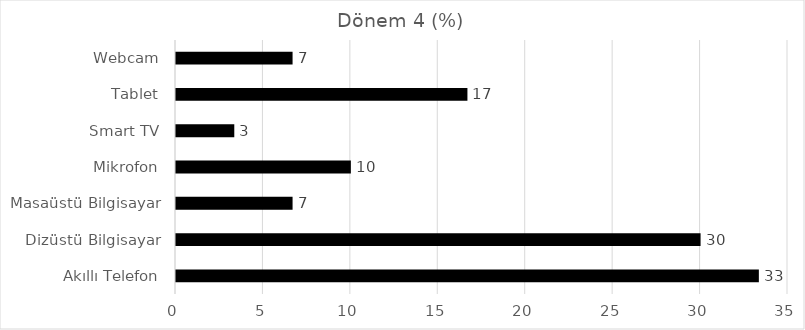
| Category | Dönem 4 (%) |
|---|---|
| Akıllı Telefon | 33.333 |
| Dizüstü Bilgisayar | 30 |
| Masaüstü Bilgisayar | 6.667 |
| Mikrofon | 10 |
| Smart TV | 3.333 |
| Tablet | 16.667 |
| Webcam | 6.667 |